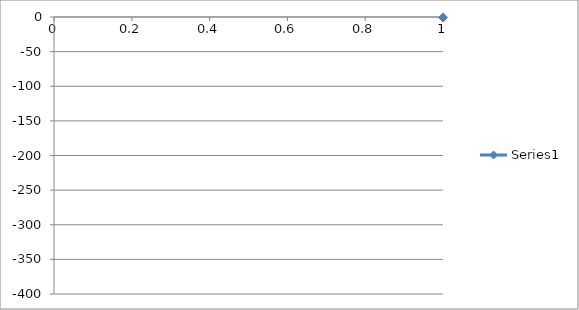
| Category | Series 0 |
|---|---|
| 0 | -0.661 |
| 1 | -0.738 |
| 2 | -0.815 |
| 3 | -0.873 |
| 4 | -0.928 |
| 5 | -0.986 |
| 6 | -1.067 |
| 7 | -1.134 |
| 8 | -1.222 |
| 9 | -1.331 |
| 10 | -1.45 |
| 11 | -1.574 |
| 12 | -1.706 |
| 13 | -1.881 |
| 14 | -2.048 |
| 15 | -2.3 |
| 16 | -2.525 |
| 17 | -2.77 |
| 18 | -3.061 |
| 19 | -3.406 |
| 20 | -3.842 |
| 21 | -4.314 |
| 22 | -4.903 |
| 23 | -5.596 |
| 24 | -6.943 |
| 25 | -7.58 |
| 26 | -9.178 |
| 27 | -10.863 |
| 28 | -13.444 |
| 29 | -16.038 |
| 30 | -19.724 |
| 31 | -21.326 |
| 32 | -23.173 |
| 33 | -25.646 |
| 34 | -28.128 |
| 35 | -30.815 |
| 36 | -33.545 |
| 37 | -37.433 |
| 38 | -40.714 |
| 39 | -44.98 |
| 40 | -49.995 |
| 41 | -55.531 |
| 42 | -61.349 |
| 43 | -67.744 |
| 44 | -74.865 |
| 45 | -83.477 |
| 46 | -91.859 |
| 47 | -102 |
| 48 | -112.25 |
| 49 | -123.727 |
| 50 | -135.397 |
| 51 | -148.068 |
| 52 | -160.845 |
| 53 | -174.823 |
| 54 | -188.51 |
| 55 | -202.413 |
| 56 | -216.376 |
| 57 | -230.077 |
| 58 | -243.44 |
| 59 | -256.229 |
| 60 | -268.274 |
| 61 | -279.438 |
| 62 | -290.195 |
| 63 | -299.272 |
| 64 | -307.698 |
| 65 | -315.386 |
| 66 | -322.445 |
| 67 | -328.36 |
| 68 | -332.835 |
| 69 | -337.455 |
| 70 | -340.711 |
| 71 | -343.495 |
| 72 | -346.059 |
| 73 | -347.663 |
| 74 | -349.077 |
| 75 | -350.274 |
| 76 | -350.644 |
| 77 | -351.088 |
| 78 | -351.462 |
| 79 | -351.759 |
| 80 | -351.952 |
| 81 | -352.053 |
| 82 | -352.088 |
| 83 | -351.996 |
| 84 | -351.725 |
| 85 | -351.334 |
| 86 | -350.628 |
| 87 | -349.207 |
| 88 | -347.687 |
| 89 | -345.789 |
| 90 | -342.876 |
| 91 | -339.541 |
| 92 | -334.872 |
| 93 | -329.931 |
| 94 | -324.059 |
| 95 | -317.497 |
| 96 | -309.531 |
| 97 | -301.069 |
| 98 | -291.128 |
| 99 | -280.928 |
| 100 | -269.418 |
| 101 | -257.713 |
| 102 | -244.677 |
| 103 | -230.93 |
| 104 | -217.551 |
| 105 | -203.453 |
| 106 | -189.505 |
| 107 | -175.555 |
| 108 | -161.915 |
| 109 | -148.691 |
| 110 | -136.266 |
| 111 | -123.949 |
| 112 | -113.052 |
| 113 | -102.239 |
| 114 | -92.371 |
| 115 | -83.58 |
| 116 | -76.236 |
| 117 | -68.755 |
| 118 | -61.756 |
| 119 | -56.082 |
| 120 | -50.72 |
| 121 | -46.163 |
| 122 | -41.938 |
| 123 | -37.798 |
| 124 | -34.167 |
| 125 | -31.295 |
| 126 | -28.593 |
| 127 | -26.088 |
| 128 | -23.716 |
| 129 | -22.052 |
| 130 | -20.371 |
| 131 | -16.512 |
| 132 | -13.775 |
| 133 | -11.346 |
| 134 | -9.82 |
| 135 | -8.295 |
| 136 | -6.944 |
| 137 | -6.386 |
| 138 | -5.646 |
| 139 | -4.963 |
| 140 | -4.377 |
| 141 | -3.868 |
| 142 | -3.403 |
| 143 | -3.031 |
| 144 | -2.692 |
| 145 | -2.418 |
| 146 | -2.173 |
| 147 | -1.972 |
| 148 | -1.752 |
| 149 | -1.599 |
| 150 | -1.456 |
| 151 | -1.32 |
| 152 | -1.177 |
| 153 | -1.057 |
| 154 | -0.954 |
| 155 | -0.877 |
| 156 | -0.791 |
| 157 | -0.713 |
| 158 | -0.638 |
| 159 | -0.569 |
| 160 | -0.513 |